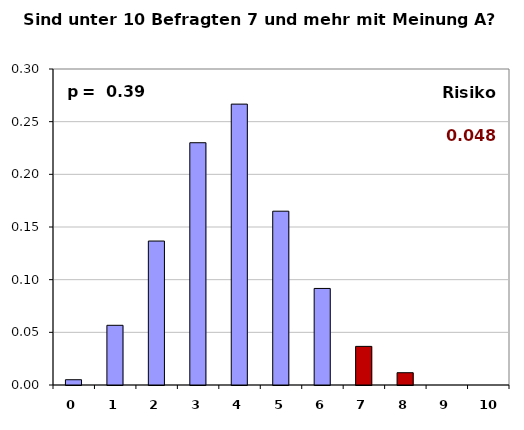
| Category | Series 0 |
|---|---|
| 0.0 | 0.005 |
| 1.0 | 0.057 |
| 2.0 | 0.137 |
| 3.0 | 0.23 |
| 4.0 | 0.267 |
| 5.0 | 0.165 |
| 6.0 | 0.092 |
| 7.0 | 0.037 |
| 8.0 | 0.012 |
| 9.0 | 0 |
| 10.0 | 0 |